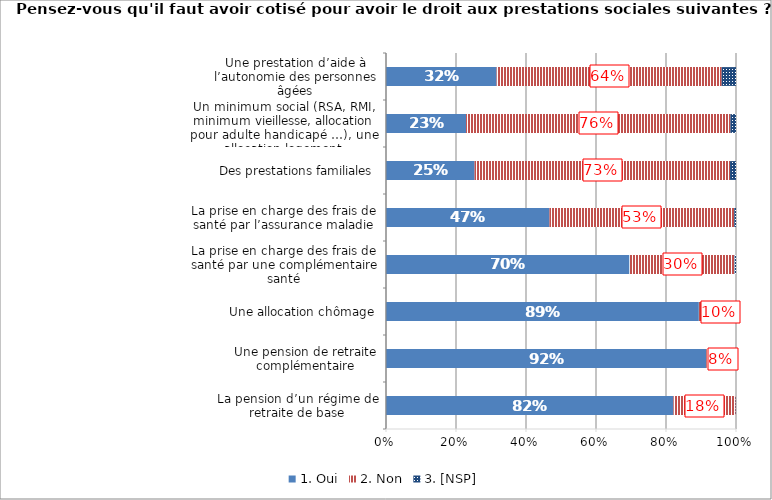
| Category | 1. Oui | 2. Non | 3. [NSP] |
|---|---|---|---|
| La pension d’un régime de retraite de base | 0.822 | 0.178 | 0.001 |
| Une pension de retraite complémentaire | 0.915 | 0.081 | 0.004 |
| Une allocation chômage | 0.894 | 0.102 | 0.004 |
| La prise en charge des frais de santé par une complémentaire santé | 0.695 | 0.3 | 0.004 |
| La prise en charge des frais de santé par l’assurance maladie | 0.467 | 0.528 | 0.005 |
| Des prestations familiales | 0.253 | 0.73 | 0.017 |
| Un minimum social (RSA, RMI, minimum vieillesse, allocation pour adulte handicapé …), une allocation logement | 0.229 | 0.756 | 0.016 |
| Une prestation d’aide à l’autonomie des personnes âgées | 0.316 | 0.643 | 0.041 |